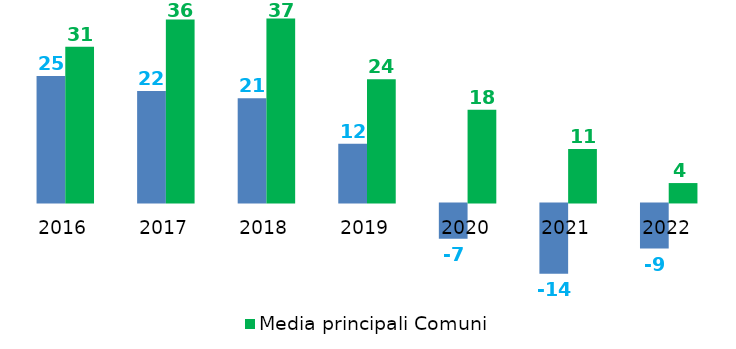
| Category | Indicatore annuale di tempestività dei pagamenti | Media principali Comuni |
|---|---|---|
| 2016.0 | 25.12 | 30.939 |
| 2017.0 | 22.11 | 36.337 |
| 2018.0 | 20.67 | 36.522 |
| 2019.0 | 11.66 | 24.474 |
| 2020.0 | -7 | 18.42 |
| 2021.0 | -13.95 | 10.619 |
| 2022.0 | -8.96 | 3.85 |